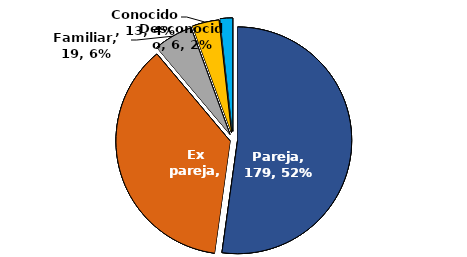
| Category | Series 0 |
|---|---|
| Pareja | 179 |
| Ex pareja | 126 |
| Familiar | 19 |
| Conocido | 13 |
| Desconocido | 6 |